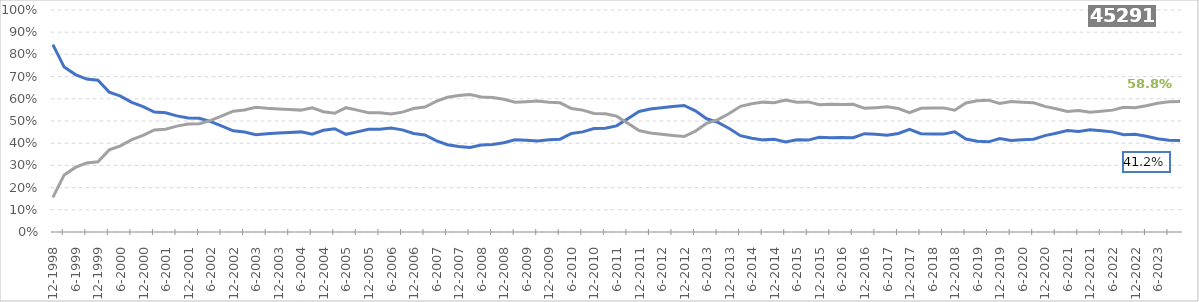
| Category | Belgium | Outside Belgium |
|---|---|---|
| 1998-12-01 | 0.844 | 0.156 |
| 1999-03-01 | 0.743 | 0.257 |
| 1999-06-01 | 0.709 | 0.291 |
| 1999-09-01 | 0.689 | 0.311 |
| 1999-12-01 | 0.684 | 0.316 |
| 2000-03-01 | 0.63 | 0.37 |
| 2000-06-01 | 0.612 | 0.388 |
| 2000-09-01 | 0.584 | 0.416 |
| 2000-12-01 | 0.565 | 0.435 |
| 2001-03-01 | 0.54 | 0.46 |
| 2001-06-01 | 0.537 | 0.463 |
| 2001-09-01 | 0.523 | 0.477 |
| 2001-12-01 | 0.514 | 0.486 |
| 2002-03-01 | 0.512 | 0.488 |
| 2002-06-01 | 0.497 | 0.503 |
| 2002-09-01 | 0.477 | 0.523 |
| 2002-12-01 | 0.456 | 0.544 |
| 2003-03-01 | 0.45 | 0.55 |
| 2003-06-01 | 0.438 | 0.562 |
| 2003-09-01 | 0.443 | 0.557 |
| 2003-12-01 | 0.446 | 0.554 |
| 2004-03-01 | 0.448 | 0.552 |
| 2004-06-01 | 0.451 | 0.549 |
| 2004-09-01 | 0.441 | 0.559 |
| 2004-12-01 | 0.458 | 0.542 |
| 2005-03-01 | 0.465 | 0.535 |
| 2005-06-01 | 0.44 | 0.56 |
| 2005-09-01 | 0.451 | 0.549 |
| 2005-12-01 | 0.463 | 0.537 |
| 2006-03-01 | 0.463 | 0.537 |
| 2006-06-01 | 0.468 | 0.532 |
| 2006-09-01 | 0.46 | 0.54 |
| 2006-12-01 | 0.444 | 0.556 |
| 2007-03-01 | 0.437 | 0.563 |
| 2007-06-01 | 0.412 | 0.588 |
| 2007-09-01 | 0.393 | 0.607 |
| 2007-12-01 | 0.385 | 0.615 |
| 2008-03-01 | 0.381 | 0.619 |
| 2008-06-01 | 0.392 | 0.608 |
| 2008-09-01 | 0.394 | 0.606 |
| 2008-12-01 | 0.402 | 0.598 |
| 2009-03-01 | 0.415 | 0.585 |
| 2009-06-01 | 0.413 | 0.587 |
| 2009-09-01 | 0.41 | 0.59 |
| 2009-12-01 | 0.416 | 0.584 |
| 2010-03-01 | 0.418 | 0.582 |
| 2010-06-01 | 0.444 | 0.556 |
| 2010-09-01 | 0.451 | 0.549 |
| 2010-12-01 | 0.466 | 0.534 |
| 2011-03-01 | 0.467 | 0.533 |
| 2011-06-01 | 0.478 | 0.522 |
| 2011-09-01 | 0.51 | 0.49 |
| 2011-12-01 | 0.543 | 0.457 |
| 2012-03-01 | 0.554 | 0.446 |
| 2012-06-01 | 0.56 | 0.44 |
| 2012-09-01 | 0.565 | 0.435 |
| 2012-12-01 | 0.57 | 0.43 |
| 2013-03-01 | 0.546 | 0.454 |
| 2013-06-01 | 0.51 | 0.49 |
| 2013-09-01 | 0.494 | 0.506 |
| 2013-12-01 | 0.466 | 0.534 |
| 2014-03-01 | 0.434 | 0.566 |
| 2014-06-01 | 0.422 | 0.578 |
| 2014-09-01 | 0.415 | 0.585 |
| 2014-12-01 | 0.418 | 0.582 |
| 2015-03-01 | 0.406 | 0.594 |
| 2015-06-01 | 0.415 | 0.585 |
| 2015-09-01 | 0.414 | 0.586 |
| 2015-12-01 | 0.427 | 0.573 |
| 2016-03-01 | 0.425 | 0.575 |
| 2016-06-01 | 0.426 | 0.574 |
| 2016-09-01 | 0.425 | 0.575 |
| 2016-12-01 | 0.443 | 0.557 |
| 2017-03-01 | 0.44 | 0.56 |
| 2017-06-01 | 0.436 | 0.564 |
| 2017-09-01 | 0.444 | 0.556 |
| 2017-12-01 | 0.462 | 0.538 |
| 2018-03-01 | 0.443 | 0.557 |
| 2018-06-01 | 0.442 | 0.558 |
| 2018-09-01 | 0.441 | 0.559 |
| 2018-12-01 | 0.451 | 0.549 |
| 2019-03-01 | 0.419 | 0.581 |
| 2019-06-01 | 0.409 | 0.591 |
| 2019-09-01 | 0.406 | 0.594 |
| 2019-12-01 | 0.421 | 0.579 |
| 2020-03-01 | 0.413 | 0.587 |
| 2020-06-01 | 0.415 | 0.585 |
| 2020-09-01 | 0.418 | 0.582 |
| 2020-12-01 | 0.434 | 0.566 |
| 2021-03-01 | 0.445 | 0.555 |
| 2021-06-01 | 0.457 | 0.543 |
| 2021-09-01 | 0.453 | 0.547 |
| 2021-12-01 | 0.46 | 0.54 |
| 2022-03-01 | 0.456 | 0.544 |
| 2022-06-01 | 0.451 | 0.549 |
| 2022-09-01 | 0.438 | 0.562 |
| 2022-12-01 | 0.44 | 0.56 |
| 2023-03-01 | 0.432 | 0.568 |
| 2023-06-01 | 0.42 | 0.58 |
| 2023-09-01 | 0.414 | 0.586 |
| 2023-12-01 | 0.412 | 0.588 |